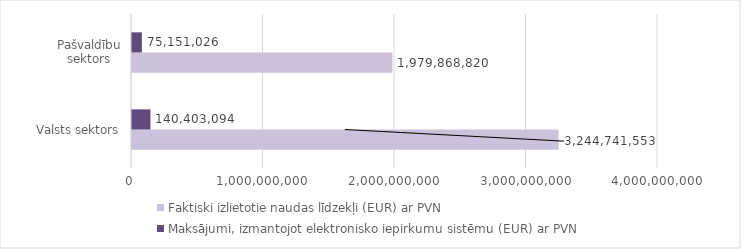
| Category | Faktiski izlietotie naudas līdzekļi (EUR) ar PVN | Maksājumi, izmantojot elektronisko iepirkumu sistēmu (EUR) ar PVN |
|---|---|---|
| Valsts sektors | 3244741553 | 140403094 |
| Pašvaldību sektors | 1979868820 | 75151026 |